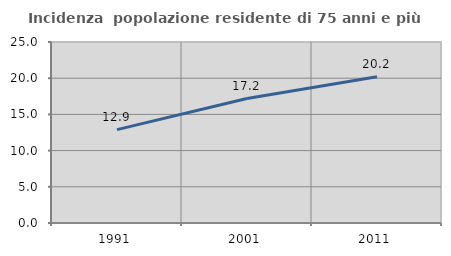
| Category | Incidenza  popolazione residente di 75 anni e più |
|---|---|
| 1991.0 | 12.897 |
| 2001.0 | 17.193 |
| 2011.0 | 20.205 |